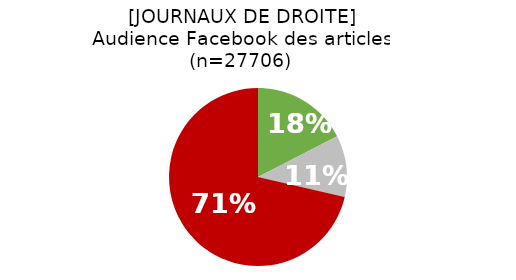
| Category | Series 0 |
|---|---|
| 0 | 0.174 |
| 1 | 0.112 |
| 2 | 0.714 |